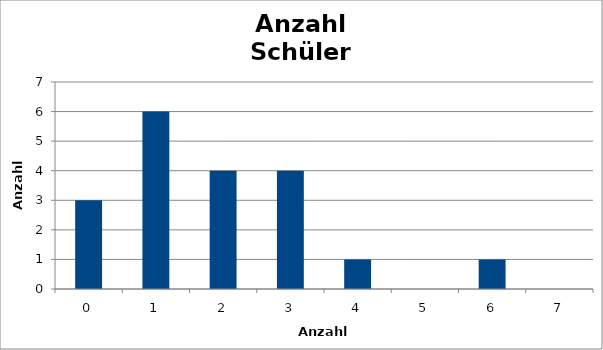
| Category | Anzahl
Schüler |
|---|---|
| 0.0 | 3 |
| 1.0 | 6 |
| 2.0 | 4 |
| 3.0 | 4 |
| 4.0 | 1 |
| 5.0 | 0 |
| 6.0 | 1 |
| 7.0 | 0 |